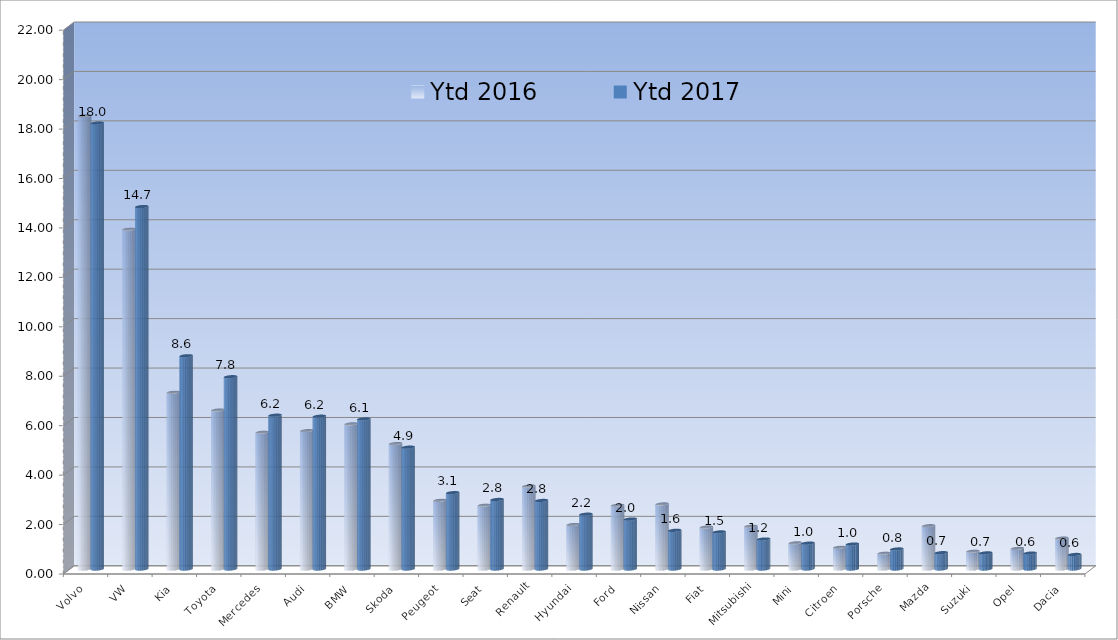
| Category | Ytd 2016 | Ytd 2017 |
|---|---|---|
| Volvo | 18.336 | 18.043 |
| VW | 13.747 | 14.662 |
| Kia | 7.149 | 8.626 |
| Toyota | 6.43 | 7.779 |
| Mercedes | 5.533 | 6.222 |
| Audi | 5.596 | 6.181 |
| BMW | 5.87 | 6.07 |
| Skoda | 5.073 | 4.93 |
| Peugeot | 2.778 | 3.088 |
| Seat | 2.582 | 2.813 |
| Renault | 3.355 | 2.772 |
| Hyundai | 1.799 | 2.217 |
| Ford | 2.579 | 2.02 |
| Nissan | 2.63 | 1.565 |
| Fiat | 1.696 | 1.5 |
| Mitsubishi | 1.73 | 1.212 |
| Mini | 1.058 | 1.047 |
| Citroen | 0.877 | 1.009 |
| Porsche | 0.639 | 0.81 |
| Mazda | 1.75 | 0.661 |
| Suzuki | 0.721 | 0.651 |
| Opel | 0.833 | 0.643 |
| Dacia | 1.249 | 0.587 |